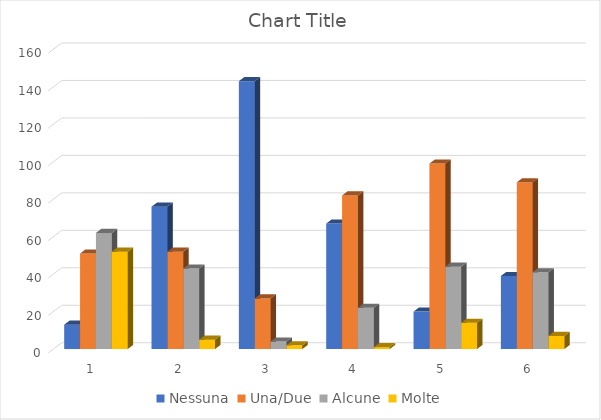
| Category | Nessuna | Una/Due | Alcune | Molte |
|---|---|---|---|---|
| 0 | 13 | 51 | 62 | 52 |
| 1 | 76 | 52 | 43 | 5 |
| 2 | 143 | 27 | 4 | 2 |
| 3 | 67 | 82 | 22 | 1 |
| 4 | 20 | 99 | 44 | 14 |
| 5 | 39 | 89 | 41 | 7 |